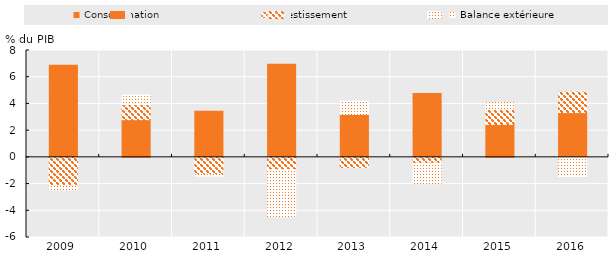
| Category | Consommation | Investissement | Balance extérieure |
|---|---|---|---|
| 2009.0 | 6.9 | -2.13 | -0.31 |
| 2010.0 | 2.82 | 1.12 | 0.73 |
| 2011.0 | 3.45 | -1.28 | -0.13 |
| 2012.0 | 6.97 | -0.92 | -3.53 |
| 2013.0 | 3.21 | -0.76 | 1 |
| 2014.0 | 4.78 | -0.43 | -1.54 |
| 2015.0 | 2.47 | 1.12 | 0.52 |
| 2016.0 | 3.35 | 1.53 | -1.44 |